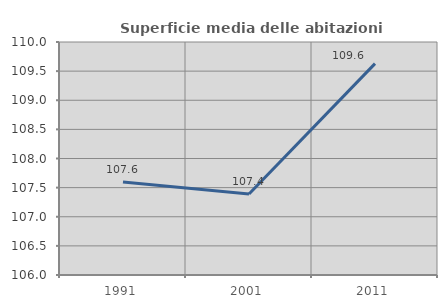
| Category | Superficie media delle abitazioni occupate |
|---|---|
| 1991.0 | 107.597 |
| 2001.0 | 107.389 |
| 2011.0 | 109.629 |